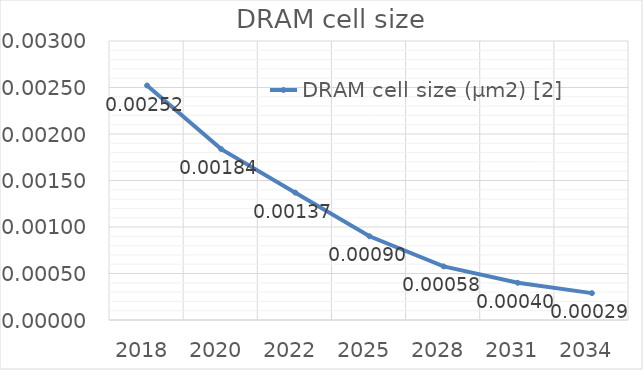
| Category | DRAM cell size (µm2) [2] |
|---|---|
| 2018.0 | 0.003 |
| 2020.0 | 0.002 |
| 2022.0 | 0.001 |
| 2025.0 | 0.001 |
| 2028.0 | 0.001 |
| 2031.0 | 0 |
| 2034.0 | 0 |